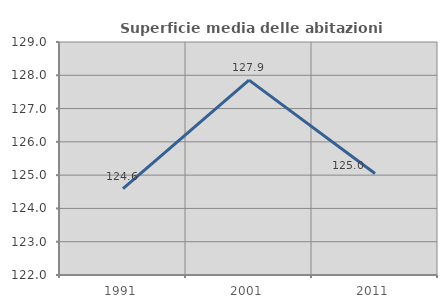
| Category | Superficie media delle abitazioni occupate |
|---|---|
| 1991.0 | 124.597 |
| 2001.0 | 127.854 |
| 2011.0 | 125.049 |